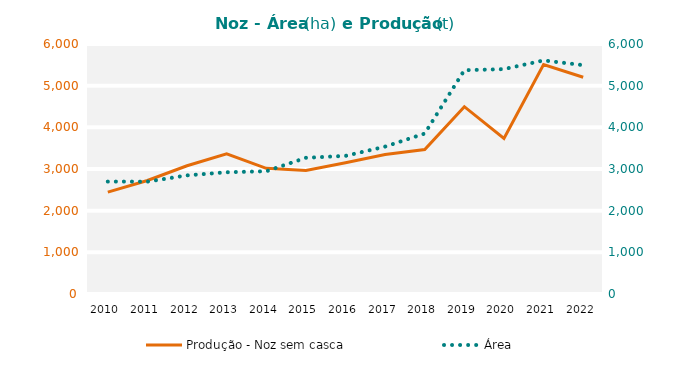
| Category | Produção - Noz sem casca |
|---|---|
| 2010 | 2445.5 |
| 2011 | 2723.63 |
| 2012 | 3077.68 |
| 2013 | 3364.57 |
| 2014 | 3017.09 |
| 2015 | 2965.26 |
| 2016 | 3149.95 |
| 2017 | 3347.05 |
| 2018 | 3467.5 |
| 2019 | 4495.34 |
| 2020 | 3731.03 |
| 2021 | 5505.66 |
| 2022 | 5201.25 |